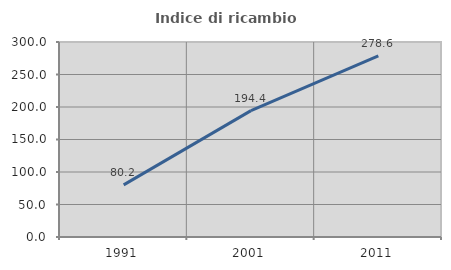
| Category | Indice di ricambio occupazionale  |
|---|---|
| 1991.0 | 80.153 |
| 2001.0 | 194.444 |
| 2011.0 | 278.571 |